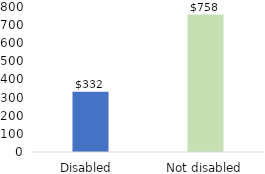
| Category | Series 0 |
|---|---|
| Disabled  | 331.889 |
| Not disabled | 758.285 |